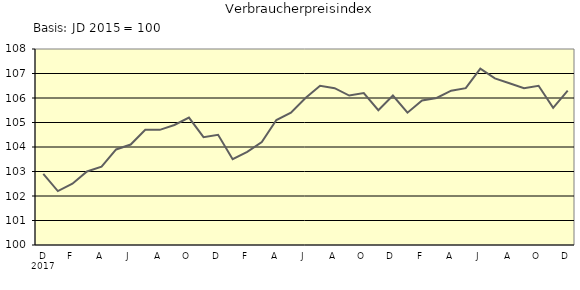
| Category | Series 0 |
|---|---|
| 0 | 102.9 |
| 1 | 102.2 |
| 2 | 102.5 |
| 3 | 103 |
| 4 | 103.2 |
| 5 | 103.9 |
| 6 | 104.1 |
| 7 | 104.7 |
| 8 | 104.7 |
| 9 | 104.9 |
| 10 | 105.2 |
| 11 | 104.4 |
| 12 | 104.5 |
| 13 | 103.5 |
| 14 | 103.8 |
| 15 | 104.2 |
| 16 | 105.1 |
| 17 | 105.4 |
| 18 | 106 |
| 19 | 106.5 |
| 20 | 106.4 |
| 21 | 106.1 |
| 22 | 106.2 |
| 23 | 105.5 |
| 24 | 106.1 |
| 25 | 105.4 |
| 26 | 105.9 |
| 27 | 106 |
| 28 | 106.3 |
| 29 | 106.4 |
| 30 | 107.2 |
| 31 | 106.8 |
| 32 | 106.6 |
| 33 | 106.4 |
| 34 | 106.5 |
| 35 | 105.6 |
| 36 | 106.3 |